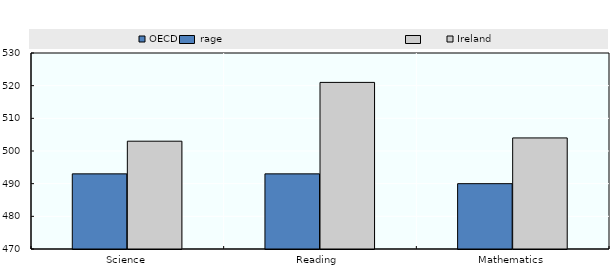
| Category | OECD Average | Ireland |
|---|---|---|
| Science | 493 | 503 |
| Reading  | 493 | 521 |
| Mathematics | 490 | 504 |